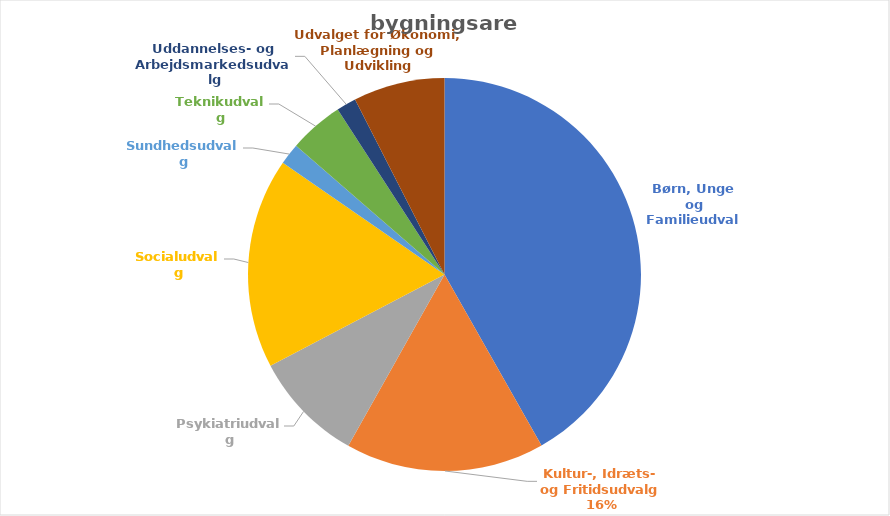
| Category | Sum af Samlet bygnings-areal |
|---|---|
| Børn, Unge og Familieudvalg | 88438 |
| Kultur-, Idræts- og Fritidsudvalg | 34627 |
| Psykiatriudvalg | 19414 |
| Socialudvalg | 36634 |
| Sundhedsudvalg | 3715 |
| Teknikudvalg | 9479 |
| Uddannelses- og Arbejdsmarkedsudvalg | 3435 |
| Udvalget for Økonomi, Planlægning og Udvikling | 15922 |